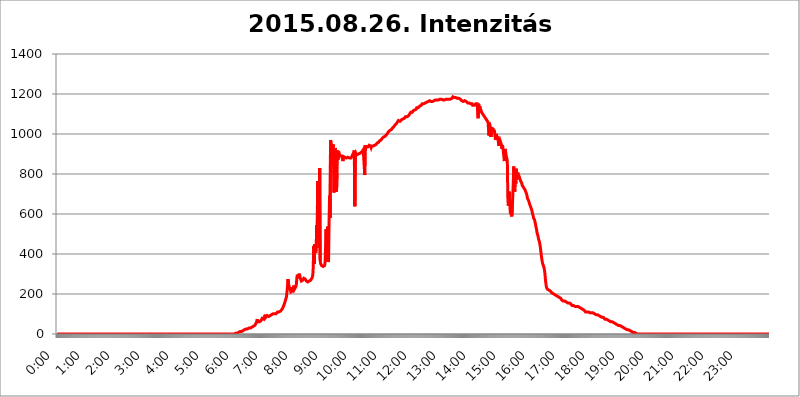
| Category | 2015.08.26. Intenzitás [W/m^2] |
|---|---|
| 0.0 | 0 |
| 0.0006944444444444445 | 0 |
| 0.001388888888888889 | 0 |
| 0.0020833333333333333 | 0 |
| 0.002777777777777778 | 0 |
| 0.003472222222222222 | 0 |
| 0.004166666666666667 | 0 |
| 0.004861111111111111 | 0 |
| 0.005555555555555556 | 0 |
| 0.0062499999999999995 | 0 |
| 0.006944444444444444 | 0 |
| 0.007638888888888889 | 0 |
| 0.008333333333333333 | 0 |
| 0.009027777777777779 | 0 |
| 0.009722222222222222 | 0 |
| 0.010416666666666666 | 0 |
| 0.011111111111111112 | 0 |
| 0.011805555555555555 | 0 |
| 0.012499999999999999 | 0 |
| 0.013194444444444444 | 0 |
| 0.013888888888888888 | 0 |
| 0.014583333333333332 | 0 |
| 0.015277777777777777 | 0 |
| 0.015972222222222224 | 0 |
| 0.016666666666666666 | 0 |
| 0.017361111111111112 | 0 |
| 0.018055555555555557 | 0 |
| 0.01875 | 0 |
| 0.019444444444444445 | 0 |
| 0.02013888888888889 | 0 |
| 0.020833333333333332 | 0 |
| 0.02152777777777778 | 0 |
| 0.022222222222222223 | 0 |
| 0.02291666666666667 | 0 |
| 0.02361111111111111 | 0 |
| 0.024305555555555556 | 0 |
| 0.024999999999999998 | 0 |
| 0.025694444444444447 | 0 |
| 0.02638888888888889 | 0 |
| 0.027083333333333334 | 0 |
| 0.027777777777777776 | 0 |
| 0.02847222222222222 | 0 |
| 0.029166666666666664 | 0 |
| 0.029861111111111113 | 0 |
| 0.030555555555555555 | 0 |
| 0.03125 | 0 |
| 0.03194444444444445 | 0 |
| 0.03263888888888889 | 0 |
| 0.03333333333333333 | 0 |
| 0.034027777777777775 | 0 |
| 0.034722222222222224 | 0 |
| 0.035416666666666666 | 0 |
| 0.036111111111111115 | 0 |
| 0.03680555555555556 | 0 |
| 0.0375 | 0 |
| 0.03819444444444444 | 0 |
| 0.03888888888888889 | 0 |
| 0.03958333333333333 | 0 |
| 0.04027777777777778 | 0 |
| 0.04097222222222222 | 0 |
| 0.041666666666666664 | 0 |
| 0.042361111111111106 | 0 |
| 0.04305555555555556 | 0 |
| 0.043750000000000004 | 0 |
| 0.044444444444444446 | 0 |
| 0.04513888888888889 | 0 |
| 0.04583333333333334 | 0 |
| 0.04652777777777778 | 0 |
| 0.04722222222222222 | 0 |
| 0.04791666666666666 | 0 |
| 0.04861111111111111 | 0 |
| 0.049305555555555554 | 0 |
| 0.049999999999999996 | 0 |
| 0.05069444444444445 | 0 |
| 0.051388888888888894 | 0 |
| 0.052083333333333336 | 0 |
| 0.05277777777777778 | 0 |
| 0.05347222222222222 | 0 |
| 0.05416666666666667 | 0 |
| 0.05486111111111111 | 0 |
| 0.05555555555555555 | 0 |
| 0.05625 | 0 |
| 0.05694444444444444 | 0 |
| 0.057638888888888885 | 0 |
| 0.05833333333333333 | 0 |
| 0.05902777777777778 | 0 |
| 0.059722222222222225 | 0 |
| 0.06041666666666667 | 0 |
| 0.061111111111111116 | 0 |
| 0.06180555555555556 | 0 |
| 0.0625 | 0 |
| 0.06319444444444444 | 0 |
| 0.06388888888888888 | 0 |
| 0.06458333333333334 | 0 |
| 0.06527777777777778 | 0 |
| 0.06597222222222222 | 0 |
| 0.06666666666666667 | 0 |
| 0.06736111111111111 | 0 |
| 0.06805555555555555 | 0 |
| 0.06874999999999999 | 0 |
| 0.06944444444444443 | 0 |
| 0.07013888888888889 | 0 |
| 0.07083333333333333 | 0 |
| 0.07152777777777779 | 0 |
| 0.07222222222222223 | 0 |
| 0.07291666666666667 | 0 |
| 0.07361111111111111 | 0 |
| 0.07430555555555556 | 0 |
| 0.075 | 0 |
| 0.07569444444444444 | 0 |
| 0.0763888888888889 | 0 |
| 0.07708333333333334 | 0 |
| 0.07777777777777778 | 0 |
| 0.07847222222222222 | 0 |
| 0.07916666666666666 | 0 |
| 0.0798611111111111 | 0 |
| 0.08055555555555556 | 0 |
| 0.08125 | 0 |
| 0.08194444444444444 | 0 |
| 0.08263888888888889 | 0 |
| 0.08333333333333333 | 0 |
| 0.08402777777777777 | 0 |
| 0.08472222222222221 | 0 |
| 0.08541666666666665 | 0 |
| 0.08611111111111112 | 0 |
| 0.08680555555555557 | 0 |
| 0.08750000000000001 | 0 |
| 0.08819444444444445 | 0 |
| 0.08888888888888889 | 0 |
| 0.08958333333333333 | 0 |
| 0.09027777777777778 | 0 |
| 0.09097222222222222 | 0 |
| 0.09166666666666667 | 0 |
| 0.09236111111111112 | 0 |
| 0.09305555555555556 | 0 |
| 0.09375 | 0 |
| 0.09444444444444444 | 0 |
| 0.09513888888888888 | 0 |
| 0.09583333333333333 | 0 |
| 0.09652777777777777 | 0 |
| 0.09722222222222222 | 0 |
| 0.09791666666666667 | 0 |
| 0.09861111111111111 | 0 |
| 0.09930555555555555 | 0 |
| 0.09999999999999999 | 0 |
| 0.10069444444444443 | 0 |
| 0.1013888888888889 | 0 |
| 0.10208333333333335 | 0 |
| 0.10277777777777779 | 0 |
| 0.10347222222222223 | 0 |
| 0.10416666666666667 | 0 |
| 0.10486111111111111 | 0 |
| 0.10555555555555556 | 0 |
| 0.10625 | 0 |
| 0.10694444444444444 | 0 |
| 0.1076388888888889 | 0 |
| 0.10833333333333334 | 0 |
| 0.10902777777777778 | 0 |
| 0.10972222222222222 | 0 |
| 0.1111111111111111 | 0 |
| 0.11180555555555556 | 0 |
| 0.11180555555555556 | 0 |
| 0.1125 | 0 |
| 0.11319444444444444 | 0 |
| 0.11388888888888889 | 0 |
| 0.11458333333333333 | 0 |
| 0.11527777777777777 | 0 |
| 0.11597222222222221 | 0 |
| 0.11666666666666665 | 0 |
| 0.1173611111111111 | 0 |
| 0.11805555555555557 | 0 |
| 0.11944444444444445 | 0 |
| 0.12013888888888889 | 0 |
| 0.12083333333333333 | 0 |
| 0.12152777777777778 | 0 |
| 0.12222222222222223 | 0 |
| 0.12291666666666667 | 0 |
| 0.12291666666666667 | 0 |
| 0.12361111111111112 | 0 |
| 0.12430555555555556 | 0 |
| 0.125 | 0 |
| 0.12569444444444444 | 0 |
| 0.12638888888888888 | 0 |
| 0.12708333333333333 | 0 |
| 0.16875 | 0 |
| 0.12847222222222224 | 0 |
| 0.12916666666666668 | 0 |
| 0.12986111111111112 | 0 |
| 0.13055555555555556 | 0 |
| 0.13125 | 0 |
| 0.13194444444444445 | 0 |
| 0.1326388888888889 | 0 |
| 0.13333333333333333 | 0 |
| 0.13402777777777777 | 0 |
| 0.13402777777777777 | 0 |
| 0.13472222222222222 | 0 |
| 0.13541666666666666 | 0 |
| 0.1361111111111111 | 0 |
| 0.13749999999999998 | 0 |
| 0.13819444444444443 | 0 |
| 0.1388888888888889 | 0 |
| 0.13958333333333334 | 0 |
| 0.14027777777777778 | 0 |
| 0.14097222222222222 | 0 |
| 0.14166666666666666 | 0 |
| 0.1423611111111111 | 0 |
| 0.14305555555555557 | 0 |
| 0.14375000000000002 | 0 |
| 0.14444444444444446 | 0 |
| 0.1451388888888889 | 0 |
| 0.1451388888888889 | 0 |
| 0.14652777777777778 | 0 |
| 0.14722222222222223 | 0 |
| 0.14791666666666667 | 0 |
| 0.1486111111111111 | 0 |
| 0.14930555555555555 | 0 |
| 0.15 | 0 |
| 0.15069444444444444 | 0 |
| 0.15138888888888888 | 0 |
| 0.15208333333333332 | 0 |
| 0.15277777777777776 | 0 |
| 0.15347222222222223 | 0 |
| 0.15416666666666667 | 0 |
| 0.15486111111111112 | 0 |
| 0.15555555555555556 | 0 |
| 0.15625 | 0 |
| 0.15694444444444444 | 0 |
| 0.15763888888888888 | 0 |
| 0.15833333333333333 | 0 |
| 0.15902777777777777 | 0 |
| 0.15972222222222224 | 0 |
| 0.16041666666666668 | 0 |
| 0.16111111111111112 | 0 |
| 0.16180555555555556 | 0 |
| 0.1625 | 0 |
| 0.16319444444444445 | 0 |
| 0.1638888888888889 | 0 |
| 0.16458333333333333 | 0 |
| 0.16527777777777777 | 0 |
| 0.16597222222222222 | 0 |
| 0.16666666666666666 | 0 |
| 0.1673611111111111 | 0 |
| 0.16805555555555554 | 0 |
| 0.16874999999999998 | 0 |
| 0.16944444444444443 | 0 |
| 0.17013888888888887 | 0 |
| 0.1708333333333333 | 0 |
| 0.17152777777777775 | 0 |
| 0.17222222222222225 | 0 |
| 0.1729166666666667 | 0 |
| 0.17361111111111113 | 0 |
| 0.17430555555555557 | 0 |
| 0.17500000000000002 | 0 |
| 0.17569444444444446 | 0 |
| 0.1763888888888889 | 0 |
| 0.17708333333333334 | 0 |
| 0.17777777777777778 | 0 |
| 0.17847222222222223 | 0 |
| 0.17916666666666667 | 0 |
| 0.1798611111111111 | 0 |
| 0.18055555555555555 | 0 |
| 0.18125 | 0 |
| 0.18194444444444444 | 0 |
| 0.1826388888888889 | 0 |
| 0.18333333333333335 | 0 |
| 0.1840277777777778 | 0 |
| 0.18472222222222223 | 0 |
| 0.18541666666666667 | 0 |
| 0.18611111111111112 | 0 |
| 0.18680555555555556 | 0 |
| 0.1875 | 0 |
| 0.18819444444444444 | 0 |
| 0.18888888888888888 | 0 |
| 0.18958333333333333 | 0 |
| 0.19027777777777777 | 0 |
| 0.1909722222222222 | 0 |
| 0.19166666666666665 | 0 |
| 0.19236111111111112 | 0 |
| 0.19305555555555554 | 0 |
| 0.19375 | 0 |
| 0.19444444444444445 | 0 |
| 0.1951388888888889 | 0 |
| 0.19583333333333333 | 0 |
| 0.19652777777777777 | 0 |
| 0.19722222222222222 | 0 |
| 0.19791666666666666 | 0 |
| 0.1986111111111111 | 0 |
| 0.19930555555555554 | 0 |
| 0.19999999999999998 | 0 |
| 0.20069444444444443 | 0 |
| 0.20138888888888887 | 0 |
| 0.2020833333333333 | 0 |
| 0.2027777777777778 | 0 |
| 0.2034722222222222 | 0 |
| 0.2041666666666667 | 0 |
| 0.20486111111111113 | 0 |
| 0.20555555555555557 | 0 |
| 0.20625000000000002 | 0 |
| 0.20694444444444446 | 0 |
| 0.2076388888888889 | 0 |
| 0.20833333333333334 | 0 |
| 0.20902777777777778 | 0 |
| 0.20972222222222223 | 0 |
| 0.21041666666666667 | 0 |
| 0.2111111111111111 | 0 |
| 0.21180555555555555 | 0 |
| 0.2125 | 0 |
| 0.21319444444444444 | 0 |
| 0.2138888888888889 | 0 |
| 0.21458333333333335 | 0 |
| 0.2152777777777778 | 0 |
| 0.21597222222222223 | 0 |
| 0.21666666666666667 | 0 |
| 0.21736111111111112 | 0 |
| 0.21805555555555556 | 0 |
| 0.21875 | 0 |
| 0.21944444444444444 | 0 |
| 0.22013888888888888 | 0 |
| 0.22083333333333333 | 0 |
| 0.22152777777777777 | 0 |
| 0.2222222222222222 | 0 |
| 0.22291666666666665 | 0 |
| 0.2236111111111111 | 0 |
| 0.22430555555555556 | 0 |
| 0.225 | 0 |
| 0.22569444444444445 | 0 |
| 0.2263888888888889 | 0 |
| 0.22708333333333333 | 0 |
| 0.22777777777777777 | 0 |
| 0.22847222222222222 | 0 |
| 0.22916666666666666 | 0 |
| 0.2298611111111111 | 0 |
| 0.23055555555555554 | 0 |
| 0.23124999999999998 | 0 |
| 0.23194444444444443 | 0 |
| 0.23263888888888887 | 0 |
| 0.2333333333333333 | 0 |
| 0.2340277777777778 | 0 |
| 0.2347222222222222 | 0 |
| 0.2354166666666667 | 0 |
| 0.23611111111111113 | 0 |
| 0.23680555555555557 | 0 |
| 0.23750000000000002 | 0 |
| 0.23819444444444446 | 0 |
| 0.2388888888888889 | 0 |
| 0.23958333333333334 | 0 |
| 0.24027777777777778 | 0 |
| 0.24097222222222223 | 0 |
| 0.24166666666666667 | 0 |
| 0.2423611111111111 | 0 |
| 0.24305555555555555 | 0 |
| 0.24375 | 0 |
| 0.24444444444444446 | 0 |
| 0.24513888888888888 | 0 |
| 0.24583333333333335 | 0 |
| 0.2465277777777778 | 0 |
| 0.24722222222222223 | 0 |
| 0.24791666666666667 | 0 |
| 0.24861111111111112 | 3.525 |
| 0.24930555555555556 | 3.525 |
| 0.25 | 3.525 |
| 0.25069444444444444 | 3.525 |
| 0.2513888888888889 | 3.525 |
| 0.2520833333333333 | 3.525 |
| 0.25277777777777777 | 3.525 |
| 0.2534722222222222 | 7.887 |
| 0.25416666666666665 | 7.887 |
| 0.2548611111111111 | 7.887 |
| 0.2555555555555556 | 7.887 |
| 0.25625000000000003 | 12.257 |
| 0.2569444444444445 | 12.257 |
| 0.2576388888888889 | 12.257 |
| 0.25833333333333336 | 12.257 |
| 0.2590277777777778 | 12.257 |
| 0.25972222222222224 | 12.257 |
| 0.2604166666666667 | 16.636 |
| 0.2611111111111111 | 16.636 |
| 0.26180555555555557 | 21.024 |
| 0.2625 | 21.024 |
| 0.26319444444444445 | 21.024 |
| 0.2638888888888889 | 21.024 |
| 0.26458333333333334 | 25.419 |
| 0.2652777777777778 | 25.419 |
| 0.2659722222222222 | 25.419 |
| 0.26666666666666666 | 25.419 |
| 0.2673611111111111 | 25.419 |
| 0.26805555555555555 | 25.419 |
| 0.26875 | 29.823 |
| 0.26944444444444443 | 29.823 |
| 0.2701388888888889 | 29.823 |
| 0.2708333333333333 | 29.823 |
| 0.27152777777777776 | 29.823 |
| 0.2722222222222222 | 34.234 |
| 0.27291666666666664 | 34.234 |
| 0.2736111111111111 | 34.234 |
| 0.2743055555555555 | 34.234 |
| 0.27499999999999997 | 38.653 |
| 0.27569444444444446 | 38.653 |
| 0.27638888888888885 | 38.653 |
| 0.27708333333333335 | 43.079 |
| 0.2777777777777778 | 47.511 |
| 0.27847222222222223 | 47.511 |
| 0.2791666666666667 | 56.398 |
| 0.2798611111111111 | 60.85 |
| 0.28055555555555556 | 74.246 |
| 0.28125 | 60.85 |
| 0.28194444444444444 | 56.398 |
| 0.2826388888888889 | 60.85 |
| 0.2833333333333333 | 60.85 |
| 0.28402777777777777 | 60.85 |
| 0.2847222222222222 | 65.31 |
| 0.28541666666666665 | 65.31 |
| 0.28611111111111115 | 65.31 |
| 0.28680555555555554 | 69.775 |
| 0.28750000000000003 | 78.722 |
| 0.2881944444444445 | 74.246 |
| 0.2888888888888889 | 74.246 |
| 0.28958333333333336 | 74.246 |
| 0.2902777777777778 | 74.246 |
| 0.29097222222222224 | 78.722 |
| 0.2916666666666667 | 96.682 |
| 0.2923611111111111 | 83.205 |
| 0.29305555555555557 | 83.205 |
| 0.29375 | 87.692 |
| 0.29444444444444445 | 92.184 |
| 0.2951388888888889 | 87.692 |
| 0.29583333333333334 | 87.692 |
| 0.2965277777777778 | 87.692 |
| 0.2972222222222222 | 87.692 |
| 0.29791666666666666 | 87.692 |
| 0.2986111111111111 | 92.184 |
| 0.29930555555555555 | 92.184 |
| 0.3 | 92.184 |
| 0.30069444444444443 | 96.682 |
| 0.3013888888888889 | 96.682 |
| 0.3020833333333333 | 96.682 |
| 0.30277777777777776 | 101.184 |
| 0.3034722222222222 | 101.184 |
| 0.30416666666666664 | 101.184 |
| 0.3048611111111111 | 101.184 |
| 0.3055555555555555 | 101.184 |
| 0.30624999999999997 | 101.184 |
| 0.3069444444444444 | 101.184 |
| 0.3076388888888889 | 105.69 |
| 0.30833333333333335 | 105.69 |
| 0.3090277777777778 | 110.201 |
| 0.30972222222222223 | 110.201 |
| 0.3104166666666667 | 110.201 |
| 0.3111111111111111 | 110.201 |
| 0.31180555555555556 | 110.201 |
| 0.3125 | 114.716 |
| 0.31319444444444444 | 114.716 |
| 0.3138888888888889 | 119.235 |
| 0.3145833333333333 | 119.235 |
| 0.31527777777777777 | 123.758 |
| 0.3159722222222222 | 128.284 |
| 0.31666666666666665 | 132.814 |
| 0.31736111111111115 | 137.347 |
| 0.31805555555555554 | 146.423 |
| 0.31875000000000003 | 150.964 |
| 0.3194444444444445 | 160.056 |
| 0.3201388888888889 | 164.605 |
| 0.32083333333333336 | 178.264 |
| 0.3215277777777778 | 187.378 |
| 0.32222222222222224 | 210.182 |
| 0.3229166666666667 | 237.564 |
| 0.3236111111111111 | 274.047 |
| 0.32430555555555557 | 251.251 |
| 0.325 | 242.127 |
| 0.32569444444444445 | 228.436 |
| 0.3263888888888889 | 219.309 |
| 0.32708333333333334 | 233 |
| 0.3277777777777778 | 210.182 |
| 0.3284722222222222 | 205.62 |
| 0.32916666666666666 | 214.746 |
| 0.3298611111111111 | 214.746 |
| 0.33055555555555555 | 219.309 |
| 0.33125 | 233 |
| 0.33194444444444443 | 242.127 |
| 0.3326388888888889 | 223.873 |
| 0.3333333333333333 | 228.436 |
| 0.3340277777777778 | 228.436 |
| 0.3347222222222222 | 237.564 |
| 0.3354166666666667 | 251.251 |
| 0.3361111111111111 | 283.156 |
| 0.3368055555555556 | 296.808 |
| 0.33749999999999997 | 292.259 |
| 0.33819444444444446 | 278.603 |
| 0.33888888888888885 | 283.156 |
| 0.33958333333333335 | 301.354 |
| 0.34027777777777773 | 287.709 |
| 0.34097222222222223 | 278.603 |
| 0.3416666666666666 | 278.603 |
| 0.3423611111111111 | 264.932 |
| 0.3430555555555555 | 269.49 |
| 0.34375 | 269.49 |
| 0.3444444444444445 | 269.49 |
| 0.3451388888888889 | 274.047 |
| 0.3458333333333334 | 278.603 |
| 0.34652777777777777 | 278.603 |
| 0.34722222222222227 | 278.603 |
| 0.34791666666666665 | 274.047 |
| 0.34861111111111115 | 269.49 |
| 0.34930555555555554 | 264.932 |
| 0.35000000000000003 | 260.373 |
| 0.3506944444444444 | 260.373 |
| 0.3513888888888889 | 260.373 |
| 0.3520833333333333 | 260.373 |
| 0.3527777777777778 | 260.373 |
| 0.3534722222222222 | 264.932 |
| 0.3541666666666667 | 264.932 |
| 0.3548611111111111 | 269.49 |
| 0.35555555555555557 | 269.49 |
| 0.35625 | 269.49 |
| 0.35694444444444445 | 274.047 |
| 0.3576388888888889 | 283.156 |
| 0.35833333333333334 | 292.259 |
| 0.3590277777777778 | 333.113 |
| 0.3597222222222222 | 440.702 |
| 0.36041666666666666 | 351.198 |
| 0.3611111111111111 | 449.551 |
| 0.36180555555555555 | 436.27 |
| 0.3625 | 405.108 |
| 0.36319444444444443 | 436.27 |
| 0.3638888888888889 | 545.416 |
| 0.3645833333333333 | 484.735 |
| 0.3652777777777778 | 763.674 |
| 0.3659722222222222 | 480.356 |
| 0.3666666666666667 | 703.762 |
| 0.3673611111111111 | 431.833 |
| 0.3680555555555556 | 829.981 |
| 0.36874999999999997 | 369.23 |
| 0.36944444444444446 | 351.198 |
| 0.37013888888888885 | 346.682 |
| 0.37083333333333335 | 342.162 |
| 0.37152777777777773 | 342.162 |
| 0.37222222222222223 | 337.639 |
| 0.3729166666666666 | 337.639 |
| 0.3736111111111111 | 337.639 |
| 0.3743055555555555 | 342.162 |
| 0.375 | 342.162 |
| 0.3756944444444445 | 360.221 |
| 0.3763888888888889 | 364.728 |
| 0.3770833333333334 | 523.88 |
| 0.37777777777777777 | 369.23 |
| 0.37847222222222227 | 449.551 |
| 0.37916666666666665 | 536.82 |
| 0.37986111111111115 | 360.221 |
| 0.38055555555555554 | 369.23 |
| 0.38125000000000003 | 566.793 |
| 0.3819444444444444 | 691.608 |
| 0.3826388888888889 | 579.542 |
| 0.3833333333333333 | 970.034 |
| 0.3840277777777778 | 947.58 |
| 0.3847222222222222 | 856.855 |
| 0.3854166666666667 | 925.06 |
| 0.3861111111111111 | 879.719 |
| 0.38680555555555557 | 947.58 |
| 0.3875 | 845.365 |
| 0.38819444444444445 | 707.8 |
| 0.3888888888888889 | 909.996 |
| 0.38958333333333334 | 928.819 |
| 0.3902777777777778 | 921.298 |
| 0.3909722222222222 | 853.029 |
| 0.39166666666666666 | 711.832 |
| 0.3923611111111111 | 798.974 |
| 0.39305555555555555 | 917.534 |
| 0.39375 | 872.114 |
| 0.39444444444444443 | 913.766 |
| 0.3951388888888889 | 906.223 |
| 0.3958333333333333 | 898.668 |
| 0.3965277777777778 | 894.885 |
| 0.3972222222222222 | 891.099 |
| 0.3979166666666667 | 891.099 |
| 0.3986111111111111 | 891.099 |
| 0.3993055555555556 | 887.309 |
| 0.39999999999999997 | 887.309 |
| 0.40069444444444446 | 864.493 |
| 0.40138888888888885 | 887.309 |
| 0.40208333333333335 | 887.309 |
| 0.40277777777777773 | 887.309 |
| 0.40347222222222223 | 883.516 |
| 0.4041666666666666 | 883.516 |
| 0.4048611111111111 | 883.516 |
| 0.4055555555555555 | 879.719 |
| 0.40625 | 879.719 |
| 0.4069444444444445 | 879.719 |
| 0.4076388888888889 | 883.516 |
| 0.4083333333333334 | 883.516 |
| 0.40902777777777777 | 879.719 |
| 0.40972222222222227 | 879.719 |
| 0.41041666666666665 | 879.719 |
| 0.41111111111111115 | 879.719 |
| 0.41180555555555554 | 879.719 |
| 0.41250000000000003 | 883.516 |
| 0.4131944444444444 | 887.309 |
| 0.4138888888888889 | 894.885 |
| 0.4145833333333333 | 898.668 |
| 0.4152777777777778 | 902.447 |
| 0.4159722222222222 | 906.223 |
| 0.4166666666666667 | 917.534 |
| 0.4173611111111111 | 638.256 |
| 0.41805555555555557 | 894.885 |
| 0.41875 | 902.447 |
| 0.41944444444444445 | 894.885 |
| 0.4201388888888889 | 894.885 |
| 0.42083333333333334 | 898.668 |
| 0.4215277777777778 | 898.668 |
| 0.4222222222222222 | 902.447 |
| 0.42291666666666666 | 902.447 |
| 0.4236111111111111 | 902.447 |
| 0.42430555555555555 | 902.447 |
| 0.425 | 906.223 |
| 0.42569444444444443 | 906.223 |
| 0.4263888888888889 | 909.996 |
| 0.4270833333333333 | 909.996 |
| 0.4277777777777778 | 913.766 |
| 0.4284722222222222 | 917.534 |
| 0.4291666666666667 | 921.298 |
| 0.4298611111111111 | 925.06 |
| 0.4305555555555556 | 925.06 |
| 0.43124999999999997 | 795.074 |
| 0.43194444444444446 | 943.832 |
| 0.43263888888888885 | 928.819 |
| 0.43333333333333335 | 928.819 |
| 0.43402777777777773 | 936.33 |
| 0.43472222222222223 | 932.576 |
| 0.4354166666666666 | 932.576 |
| 0.4361111111111111 | 936.33 |
| 0.4368055555555555 | 940.082 |
| 0.4375 | 943.832 |
| 0.4381944444444445 | 943.832 |
| 0.4388888888888889 | 940.082 |
| 0.4395833333333334 | 940.082 |
| 0.44027777777777777 | 932.576 |
| 0.44097222222222227 | 940.082 |
| 0.44166666666666665 | 940.082 |
| 0.44236111111111115 | 940.082 |
| 0.44305555555555554 | 940.082 |
| 0.44375000000000003 | 940.082 |
| 0.4444444444444444 | 943.832 |
| 0.4451388888888889 | 943.832 |
| 0.4458333333333333 | 947.58 |
| 0.4465277777777778 | 947.58 |
| 0.4472222222222222 | 947.58 |
| 0.4479166666666667 | 951.327 |
| 0.4486111111111111 | 955.071 |
| 0.44930555555555557 | 955.071 |
| 0.45 | 958.814 |
| 0.45069444444444445 | 958.814 |
| 0.4513888888888889 | 962.555 |
| 0.45208333333333334 | 966.295 |
| 0.4527777777777778 | 970.034 |
| 0.4534722222222222 | 970.034 |
| 0.45416666666666666 | 970.034 |
| 0.4548611111111111 | 973.772 |
| 0.45555555555555555 | 977.508 |
| 0.45625 | 977.508 |
| 0.45694444444444443 | 981.244 |
| 0.4576388888888889 | 984.98 |
| 0.4583333333333333 | 984.98 |
| 0.4590277777777778 | 988.714 |
| 0.4597222222222222 | 988.714 |
| 0.4604166666666667 | 992.448 |
| 0.4611111111111111 | 992.448 |
| 0.4618055555555556 | 996.182 |
| 0.46249999999999997 | 999.916 |
| 0.46319444444444446 | 1003.65 |
| 0.46388888888888885 | 1007.383 |
| 0.46458333333333335 | 1011.118 |
| 0.46527777777777773 | 1014.852 |
| 0.46597222222222223 | 1014.852 |
| 0.4666666666666666 | 1018.587 |
| 0.4673611111111111 | 1018.587 |
| 0.4680555555555555 | 1018.587 |
| 0.46875 | 1022.323 |
| 0.4694444444444445 | 1026.06 |
| 0.4701388888888889 | 1029.798 |
| 0.4708333333333334 | 1029.798 |
| 0.47152777777777777 | 1033.537 |
| 0.47222222222222227 | 1037.277 |
| 0.47291666666666665 | 1041.019 |
| 0.47361111111111115 | 1044.762 |
| 0.47430555555555554 | 1044.762 |
| 0.47500000000000003 | 1048.508 |
| 0.4756944444444444 | 1052.255 |
| 0.4763888888888889 | 1056.004 |
| 0.4770833333333333 | 1059.756 |
| 0.4777777777777778 | 1063.51 |
| 0.4784722222222222 | 1067.267 |
| 0.4791666666666667 | 1063.51 |
| 0.4798611111111111 | 1067.267 |
| 0.48055555555555557 | 1063.51 |
| 0.48125 | 1063.51 |
| 0.48194444444444445 | 1067.267 |
| 0.4826388888888889 | 1071.027 |
| 0.48333333333333334 | 1074.789 |
| 0.4840277777777778 | 1071.027 |
| 0.4847222222222222 | 1074.789 |
| 0.48541666666666666 | 1074.789 |
| 0.4861111111111111 | 1074.789 |
| 0.48680555555555555 | 1078.555 |
| 0.4875 | 1082.324 |
| 0.48819444444444443 | 1086.097 |
| 0.4888888888888889 | 1086.097 |
| 0.4895833333333333 | 1086.097 |
| 0.4902777777777778 | 1086.097 |
| 0.4909722222222222 | 1086.097 |
| 0.4916666666666667 | 1086.097 |
| 0.4923611111111111 | 1089.873 |
| 0.4930555555555556 | 1093.653 |
| 0.49374999999999997 | 1093.653 |
| 0.49444444444444446 | 1101.226 |
| 0.49513888888888885 | 1105.019 |
| 0.49583333333333335 | 1108.816 |
| 0.49652777777777773 | 1108.816 |
| 0.49722222222222223 | 1108.816 |
| 0.4979166666666666 | 1108.816 |
| 0.4986111111111111 | 1112.618 |
| 0.4993055555555555 | 1116.426 |
| 0.5 | 1116.426 |
| 0.5006944444444444 | 1116.426 |
| 0.5013888888888889 | 1120.238 |
| 0.5020833333333333 | 1120.238 |
| 0.5027777777777778 | 1124.056 |
| 0.5034722222222222 | 1124.056 |
| 0.5041666666666667 | 1131.708 |
| 0.5048611111111111 | 1131.708 |
| 0.5055555555555555 | 1131.708 |
| 0.50625 | 1131.708 |
| 0.5069444444444444 | 1131.708 |
| 0.5076388888888889 | 1131.708 |
| 0.5083333333333333 | 1139.384 |
| 0.5090277777777777 | 1139.384 |
| 0.5097222222222222 | 1139.384 |
| 0.5104166666666666 | 1143.232 |
| 0.5111111111111112 | 1147.086 |
| 0.5118055555555555 | 1150.946 |
| 0.5125000000000001 | 1150.946 |
| 0.5131944444444444 | 1150.946 |
| 0.513888888888889 | 1150.946 |
| 0.5145833333333333 | 1154.814 |
| 0.5152777777777778 | 1154.814 |
| 0.5159722222222222 | 1154.814 |
| 0.5166666666666667 | 1158.689 |
| 0.517361111111111 | 1158.689 |
| 0.5180555555555556 | 1158.689 |
| 0.5187499999999999 | 1162.571 |
| 0.5194444444444445 | 1158.689 |
| 0.5201388888888888 | 1162.571 |
| 0.5208333333333334 | 1162.571 |
| 0.5215277777777778 | 1162.571 |
| 0.5222222222222223 | 1166.46 |
| 0.5229166666666667 | 1166.46 |
| 0.5236111111111111 | 1166.46 |
| 0.5243055555555556 | 1162.571 |
| 0.525 | 1166.46 |
| 0.5256944444444445 | 1162.571 |
| 0.5263888888888889 | 1162.571 |
| 0.5270833333333333 | 1162.571 |
| 0.5277777777777778 | 1166.46 |
| 0.5284722222222222 | 1166.46 |
| 0.5291666666666667 | 1170.358 |
| 0.5298611111111111 | 1170.358 |
| 0.5305555555555556 | 1170.358 |
| 0.53125 | 1170.358 |
| 0.5319444444444444 | 1170.358 |
| 0.5326388888888889 | 1170.358 |
| 0.5333333333333333 | 1174.263 |
| 0.5340277777777778 | 1170.358 |
| 0.5347222222222222 | 1170.358 |
| 0.5354166666666667 | 1174.263 |
| 0.5361111111111111 | 1174.263 |
| 0.5368055555555555 | 1174.263 |
| 0.5375 | 1174.263 |
| 0.5381944444444444 | 1178.177 |
| 0.5388888888888889 | 1174.263 |
| 0.5395833333333333 | 1170.358 |
| 0.5402777777777777 | 1170.358 |
| 0.5409722222222222 | 1170.358 |
| 0.5416666666666666 | 1170.358 |
| 0.5423611111111112 | 1170.358 |
| 0.5430555555555555 | 1170.358 |
| 0.5437500000000001 | 1174.263 |
| 0.5444444444444444 | 1174.263 |
| 0.545138888888889 | 1174.263 |
| 0.5458333333333333 | 1174.263 |
| 0.5465277777777778 | 1174.263 |
| 0.5472222222222222 | 1174.263 |
| 0.5479166666666667 | 1174.263 |
| 0.548611111111111 | 1174.263 |
| 0.5493055555555556 | 1174.263 |
| 0.5499999999999999 | 1174.263 |
| 0.5506944444444445 | 1174.263 |
| 0.5513888888888888 | 1174.263 |
| 0.5520833333333334 | 1174.263 |
| 0.5527777777777778 | 1178.177 |
| 0.5534722222222223 | 1178.177 |
| 0.5541666666666667 | 1182.099 |
| 0.5548611111111111 | 1186.03 |
| 0.5555555555555556 | 1186.03 |
| 0.55625 | 1186.03 |
| 0.5569444444444445 | 1182.099 |
| 0.5576388888888889 | 1182.099 |
| 0.5583333333333333 | 1182.099 |
| 0.5590277777777778 | 1182.099 |
| 0.5597222222222222 | 1178.177 |
| 0.5604166666666667 | 1178.177 |
| 0.5611111111111111 | 1178.177 |
| 0.5618055555555556 | 1178.177 |
| 0.5625 | 1178.177 |
| 0.5631944444444444 | 1178.177 |
| 0.5638888888888889 | 1178.177 |
| 0.5645833333333333 | 1174.263 |
| 0.5652777777777778 | 1174.263 |
| 0.5659722222222222 | 1170.358 |
| 0.5666666666666667 | 1170.358 |
| 0.5673611111111111 | 1166.46 |
| 0.5680555555555555 | 1166.46 |
| 0.56875 | 1166.46 |
| 0.5694444444444444 | 1162.571 |
| 0.5701388888888889 | 1166.46 |
| 0.5708333333333333 | 1166.46 |
| 0.5715277777777777 | 1166.46 |
| 0.5722222222222222 | 1166.46 |
| 0.5729166666666666 | 1162.571 |
| 0.5736111111111112 | 1162.571 |
| 0.5743055555555555 | 1162.571 |
| 0.5750000000000001 | 1158.689 |
| 0.5756944444444444 | 1154.814 |
| 0.576388888888889 | 1154.814 |
| 0.5770833333333333 | 1158.689 |
| 0.5777777777777778 | 1154.814 |
| 0.5784722222222222 | 1150.946 |
| 0.5791666666666667 | 1150.946 |
| 0.579861111111111 | 1150.946 |
| 0.5805555555555556 | 1150.946 |
| 0.5812499999999999 | 1147.086 |
| 0.5819444444444445 | 1150.946 |
| 0.5826388888888888 | 1143.232 |
| 0.5833333333333334 | 1143.232 |
| 0.5840277777777778 | 1143.232 |
| 0.5847222222222223 | 1143.232 |
| 0.5854166666666667 | 1147.086 |
| 0.5861111111111111 | 1147.086 |
| 0.5868055555555556 | 1150.946 |
| 0.5875 | 1150.946 |
| 0.5881944444444445 | 1150.946 |
| 0.5888888888888889 | 1150.946 |
| 0.5895833333333333 | 1154.814 |
| 0.5902777777777778 | 1078.555 |
| 0.5909722222222222 | 1150.946 |
| 0.5916666666666667 | 1124.056 |
| 0.5923611111111111 | 1139.384 |
| 0.5930555555555556 | 1120.238 |
| 0.59375 | 1105.019 |
| 0.5944444444444444 | 1116.426 |
| 0.5951388888888889 | 1108.816 |
| 0.5958333333333333 | 1105.019 |
| 0.5965277777777778 | 1101.226 |
| 0.5972222222222222 | 1097.437 |
| 0.5979166666666667 | 1093.653 |
| 0.5986111111111111 | 1089.873 |
| 0.5993055555555555 | 1089.873 |
| 0.6 | 1082.324 |
| 0.6006944444444444 | 1078.555 |
| 0.6013888888888889 | 1074.789 |
| 0.6020833333333333 | 1074.789 |
| 0.6027777777777777 | 1067.267 |
| 0.6034722222222222 | 1063.51 |
| 0.6041666666666666 | 1059.756 |
| 0.6048611111111112 | 1059.756 |
| 0.6055555555555555 | 992.448 |
| 0.6062500000000001 | 1056.004 |
| 0.6069444444444444 | 1052.255 |
| 0.607638888888889 | 1052.255 |
| 0.6083333333333333 | 984.98 |
| 0.6090277777777778 | 1029.798 |
| 0.6097222222222222 | 1033.537 |
| 0.6104166666666667 | 1026.06 |
| 0.611111111111111 | 1026.06 |
| 0.6118055555555556 | 1022.323 |
| 0.6124999999999999 | 1022.323 |
| 0.6131944444444445 | 1014.852 |
| 0.6138888888888888 | 1011.118 |
| 0.6145833333333334 | 970.034 |
| 0.6152777777777778 | 999.916 |
| 0.6159722222222223 | 992.448 |
| 0.6166666666666667 | 988.714 |
| 0.6173611111111111 | 984.98 |
| 0.6180555555555556 | 984.98 |
| 0.61875 | 958.814 |
| 0.6194444444444445 | 940.082 |
| 0.6201388888888889 | 962.555 |
| 0.6208333333333333 | 970.034 |
| 0.6215277777777778 | 962.555 |
| 0.6222222222222222 | 958.814 |
| 0.6229166666666667 | 947.58 |
| 0.6236111111111111 | 925.06 |
| 0.6243055555555556 | 943.832 |
| 0.625 | 932.576 |
| 0.6256944444444444 | 936.33 |
| 0.6263888888888889 | 928.819 |
| 0.6270833333333333 | 864.493 |
| 0.6277777777777778 | 925.06 |
| 0.6284722222222222 | 917.534 |
| 0.6291666666666667 | 902.447 |
| 0.6298611111111111 | 887.309 |
| 0.6305555555555555 | 891.099 |
| 0.63125 | 868.305 |
| 0.6319444444444444 | 683.473 |
| 0.6326388888888889 | 642.4 |
| 0.6333333333333333 | 679.395 |
| 0.6340277777777777 | 711.832 |
| 0.6347222222222222 | 646.537 |
| 0.6354166666666666 | 609.062 |
| 0.6361111111111112 | 609.062 |
| 0.6368055555555555 | 613.252 |
| 0.6375000000000001 | 588.009 |
| 0.6381944444444444 | 621.613 |
| 0.638888888888889 | 621.613 |
| 0.6395833333333333 | 759.723 |
| 0.6402777777777778 | 837.682 |
| 0.6409722222222222 | 755.766 |
| 0.6416666666666667 | 711.832 |
| 0.642361111111111 | 806.757 |
| 0.6430555555555556 | 751.803 |
| 0.6437499999999999 | 826.123 |
| 0.6444444444444445 | 771.559 |
| 0.6451388888888888 | 787.258 |
| 0.6458333333333334 | 806.757 |
| 0.6465277777777778 | 798.974 |
| 0.6472222222222223 | 795.074 |
| 0.6479166666666667 | 787.258 |
| 0.6486111111111111 | 779.42 |
| 0.6493055555555556 | 775.492 |
| 0.65 | 763.674 |
| 0.6506944444444445 | 759.723 |
| 0.6513888888888889 | 755.766 |
| 0.6520833333333333 | 743.859 |
| 0.6527777777777778 | 739.877 |
| 0.6534722222222222 | 735.89 |
| 0.6541666666666667 | 731.896 |
| 0.6548611111111111 | 727.896 |
| 0.6555555555555556 | 723.889 |
| 0.65625 | 719.877 |
| 0.6569444444444444 | 711.832 |
| 0.6576388888888889 | 707.8 |
| 0.6583333333333333 | 699.717 |
| 0.6590277777777778 | 687.544 |
| 0.6597222222222222 | 675.311 |
| 0.6604166666666667 | 671.22 |
| 0.6611111111111111 | 667.123 |
| 0.6618055555555555 | 658.909 |
| 0.6625 | 650.667 |
| 0.6631944444444444 | 642.4 |
| 0.6638888888888889 | 638.256 |
| 0.6645833333333333 | 629.948 |
| 0.6652777777777777 | 621.613 |
| 0.6659722222222222 | 613.252 |
| 0.6666666666666666 | 600.661 |
| 0.6673611111111111 | 592.233 |
| 0.6680555555555556 | 579.542 |
| 0.6687500000000001 | 575.299 |
| 0.6694444444444444 | 571.049 |
| 0.6701388888888888 | 558.261 |
| 0.6708333333333334 | 549.704 |
| 0.6715277777777778 | 532.513 |
| 0.6722222222222222 | 523.88 |
| 0.6729166666666666 | 506.542 |
| 0.6736111111111112 | 497.836 |
| 0.6743055555555556 | 489.108 |
| 0.6749999999999999 | 475.972 |
| 0.6756944444444444 | 467.187 |
| 0.6763888888888889 | 458.38 |
| 0.6770833333333334 | 445.129 |
| 0.6777777777777777 | 427.39 |
| 0.6784722222222223 | 405.108 |
| 0.6791666666666667 | 387.202 |
| 0.6798611111111111 | 369.23 |
| 0.6805555555555555 | 355.712 |
| 0.68125 | 346.682 |
| 0.6819444444444445 | 342.162 |
| 0.6826388888888889 | 333.113 |
| 0.6833333333333332 | 319.517 |
| 0.6840277777777778 | 301.354 |
| 0.6847222222222222 | 269.49 |
| 0.6854166666666667 | 251.251 |
| 0.686111111111111 | 233 |
| 0.6868055555555556 | 228.436 |
| 0.6875 | 223.873 |
| 0.6881944444444444 | 223.873 |
| 0.688888888888889 | 219.309 |
| 0.6895833333333333 | 219.309 |
| 0.6902777777777778 | 219.309 |
| 0.6909722222222222 | 214.746 |
| 0.6916666666666668 | 214.746 |
| 0.6923611111111111 | 210.182 |
| 0.6930555555555555 | 210.182 |
| 0.69375 | 205.62 |
| 0.6944444444444445 | 205.62 |
| 0.6951388888888889 | 201.058 |
| 0.6958333333333333 | 201.058 |
| 0.6965277777777777 | 201.058 |
| 0.6972222222222223 | 196.497 |
| 0.6979166666666666 | 196.497 |
| 0.6986111111111111 | 196.497 |
| 0.6993055555555556 | 191.937 |
| 0.7000000000000001 | 191.937 |
| 0.7006944444444444 | 191.937 |
| 0.7013888888888888 | 187.378 |
| 0.7020833333333334 | 187.378 |
| 0.7027777777777778 | 187.378 |
| 0.7034722222222222 | 182.82 |
| 0.7041666666666666 | 182.82 |
| 0.7048611111111112 | 182.82 |
| 0.7055555555555556 | 178.264 |
| 0.7062499999999999 | 178.264 |
| 0.7069444444444444 | 173.709 |
| 0.7076388888888889 | 169.156 |
| 0.7083333333333334 | 169.156 |
| 0.7090277777777777 | 164.605 |
| 0.7097222222222223 | 164.605 |
| 0.7104166666666667 | 164.605 |
| 0.7111111111111111 | 164.605 |
| 0.7118055555555555 | 164.605 |
| 0.7125 | 160.056 |
| 0.7131944444444445 | 160.056 |
| 0.7138888888888889 | 160.056 |
| 0.7145833333333332 | 155.509 |
| 0.7152777777777778 | 155.509 |
| 0.7159722222222222 | 155.509 |
| 0.7166666666666667 | 155.509 |
| 0.717361111111111 | 155.509 |
| 0.7180555555555556 | 155.509 |
| 0.71875 | 150.964 |
| 0.7194444444444444 | 150.964 |
| 0.720138888888889 | 150.964 |
| 0.7208333333333333 | 146.423 |
| 0.7215277777777778 | 146.423 |
| 0.7222222222222222 | 141.884 |
| 0.7229166666666668 | 146.423 |
| 0.7236111111111111 | 146.423 |
| 0.7243055555555555 | 141.884 |
| 0.725 | 137.347 |
| 0.7256944444444445 | 137.347 |
| 0.7263888888888889 | 137.347 |
| 0.7270833333333333 | 137.347 |
| 0.7277777777777777 | 137.347 |
| 0.7284722222222223 | 137.347 |
| 0.7291666666666666 | 137.347 |
| 0.7298611111111111 | 137.347 |
| 0.7305555555555556 | 137.347 |
| 0.7312500000000001 | 132.814 |
| 0.7319444444444444 | 132.814 |
| 0.7326388888888888 | 132.814 |
| 0.7333333333333334 | 132.814 |
| 0.7340277777777778 | 128.284 |
| 0.7347222222222222 | 128.284 |
| 0.7354166666666666 | 123.758 |
| 0.7361111111111112 | 123.758 |
| 0.7368055555555556 | 123.758 |
| 0.7374999999999999 | 123.758 |
| 0.7381944444444444 | 119.235 |
| 0.7388888888888889 | 119.235 |
| 0.7395833333333334 | 119.235 |
| 0.7402777777777777 | 114.716 |
| 0.7409722222222223 | 110.201 |
| 0.7416666666666667 | 110.201 |
| 0.7423611111111111 | 105.69 |
| 0.7430555555555555 | 110.201 |
| 0.74375 | 105.69 |
| 0.7444444444444445 | 105.69 |
| 0.7451388888888889 | 110.201 |
| 0.7458333333333332 | 105.69 |
| 0.7465277777777778 | 105.69 |
| 0.7472222222222222 | 105.69 |
| 0.7479166666666667 | 105.69 |
| 0.748611111111111 | 105.69 |
| 0.7493055555555556 | 105.69 |
| 0.75 | 105.69 |
| 0.7506944444444444 | 105.69 |
| 0.751388888888889 | 105.69 |
| 0.7520833333333333 | 101.184 |
| 0.7527777777777778 | 101.184 |
| 0.7534722222222222 | 101.184 |
| 0.7541666666666668 | 101.184 |
| 0.7548611111111111 | 96.682 |
| 0.7555555555555555 | 96.682 |
| 0.75625 | 96.682 |
| 0.7569444444444445 | 96.682 |
| 0.7576388888888889 | 96.682 |
| 0.7583333333333333 | 92.184 |
| 0.7590277777777777 | 92.184 |
| 0.7597222222222223 | 92.184 |
| 0.7604166666666666 | 87.692 |
| 0.7611111111111111 | 87.692 |
| 0.7618055555555556 | 87.692 |
| 0.7625000000000001 | 83.205 |
| 0.7631944444444444 | 83.205 |
| 0.7638888888888888 | 83.205 |
| 0.7645833333333334 | 83.205 |
| 0.7652777777777778 | 83.205 |
| 0.7659722222222222 | 83.205 |
| 0.7666666666666666 | 78.722 |
| 0.7673611111111112 | 78.722 |
| 0.7680555555555556 | 74.246 |
| 0.7687499999999999 | 74.246 |
| 0.7694444444444444 | 74.246 |
| 0.7701388888888889 | 74.246 |
| 0.7708333333333334 | 74.246 |
| 0.7715277777777777 | 69.775 |
| 0.7722222222222223 | 69.775 |
| 0.7729166666666667 | 69.775 |
| 0.7736111111111111 | 65.31 |
| 0.7743055555555555 | 65.31 |
| 0.775 | 65.31 |
| 0.7756944444444445 | 65.31 |
| 0.7763888888888889 | 60.85 |
| 0.7770833333333332 | 60.85 |
| 0.7777777777777778 | 60.85 |
| 0.7784722222222222 | 60.85 |
| 0.7791666666666667 | 56.398 |
| 0.779861111111111 | 56.398 |
| 0.7805555555555556 | 56.398 |
| 0.78125 | 56.398 |
| 0.7819444444444444 | 51.951 |
| 0.782638888888889 | 51.951 |
| 0.7833333333333333 | 51.951 |
| 0.7840277777777778 | 47.511 |
| 0.7847222222222222 | 47.511 |
| 0.7854166666666668 | 47.511 |
| 0.7861111111111111 | 47.511 |
| 0.7868055555555555 | 43.079 |
| 0.7875 | 43.079 |
| 0.7881944444444445 | 43.079 |
| 0.7888888888888889 | 43.079 |
| 0.7895833333333333 | 38.653 |
| 0.7902777777777777 | 38.653 |
| 0.7909722222222223 | 38.653 |
| 0.7916666666666666 | 34.234 |
| 0.7923611111111111 | 34.234 |
| 0.7930555555555556 | 34.234 |
| 0.7937500000000001 | 29.823 |
| 0.7944444444444444 | 29.823 |
| 0.7951388888888888 | 29.823 |
| 0.7958333333333334 | 29.823 |
| 0.7965277777777778 | 29.823 |
| 0.7972222222222222 | 25.419 |
| 0.7979166666666666 | 25.419 |
| 0.7986111111111112 | 25.419 |
| 0.7993055555555556 | 21.024 |
| 0.7999999999999999 | 21.024 |
| 0.8006944444444444 | 21.024 |
| 0.8013888888888889 | 21.024 |
| 0.8020833333333334 | 21.024 |
| 0.8027777777777777 | 16.636 |
| 0.8034722222222223 | 16.636 |
| 0.8041666666666667 | 12.257 |
| 0.8048611111111111 | 12.257 |
| 0.8055555555555555 | 12.257 |
| 0.80625 | 12.257 |
| 0.8069444444444445 | 12.257 |
| 0.8076388888888889 | 7.887 |
| 0.8083333333333332 | 7.887 |
| 0.8090277777777778 | 7.887 |
| 0.8097222222222222 | 7.887 |
| 0.8104166666666667 | 3.525 |
| 0.811111111111111 | 3.525 |
| 0.8118055555555556 | 3.525 |
| 0.8125 | 3.525 |
| 0.8131944444444444 | 3.525 |
| 0.813888888888889 | 0 |
| 0.8145833333333333 | 0 |
| 0.8152777777777778 | 0 |
| 0.8159722222222222 | 0 |
| 0.8166666666666668 | 0 |
| 0.8173611111111111 | 0 |
| 0.8180555555555555 | 0 |
| 0.81875 | 0 |
| 0.8194444444444445 | 0 |
| 0.8201388888888889 | 0 |
| 0.8208333333333333 | 0 |
| 0.8215277777777777 | 0 |
| 0.8222222222222223 | 0 |
| 0.8229166666666666 | 0 |
| 0.8236111111111111 | 0 |
| 0.8243055555555556 | 0 |
| 0.8250000000000001 | 0 |
| 0.8256944444444444 | 0 |
| 0.8263888888888888 | 0 |
| 0.8270833333333334 | 0 |
| 0.8277777777777778 | 0 |
| 0.8284722222222222 | 0 |
| 0.8291666666666666 | 0 |
| 0.8298611111111112 | 0 |
| 0.8305555555555556 | 0 |
| 0.8312499999999999 | 0 |
| 0.8319444444444444 | 0 |
| 0.8326388888888889 | 0 |
| 0.8333333333333334 | 0 |
| 0.8340277777777777 | 0 |
| 0.8347222222222223 | 0 |
| 0.8354166666666667 | 0 |
| 0.8361111111111111 | 0 |
| 0.8368055555555555 | 0 |
| 0.8375 | 0 |
| 0.8381944444444445 | 0 |
| 0.8388888888888889 | 0 |
| 0.8395833333333332 | 0 |
| 0.8402777777777778 | 0 |
| 0.8409722222222222 | 0 |
| 0.8416666666666667 | 0 |
| 0.842361111111111 | 0 |
| 0.8430555555555556 | 0 |
| 0.84375 | 0 |
| 0.8444444444444444 | 0 |
| 0.845138888888889 | 0 |
| 0.8458333333333333 | 0 |
| 0.8465277777777778 | 0 |
| 0.8472222222222222 | 0 |
| 0.8479166666666668 | 0 |
| 0.8486111111111111 | 0 |
| 0.8493055555555555 | 0 |
| 0.85 | 0 |
| 0.8506944444444445 | 0 |
| 0.8513888888888889 | 0 |
| 0.8520833333333333 | 0 |
| 0.8527777777777777 | 0 |
| 0.8534722222222223 | 0 |
| 0.8541666666666666 | 0 |
| 0.8548611111111111 | 0 |
| 0.8555555555555556 | 0 |
| 0.8562500000000001 | 0 |
| 0.8569444444444444 | 0 |
| 0.8576388888888888 | 0 |
| 0.8583333333333334 | 0 |
| 0.8590277777777778 | 0 |
| 0.8597222222222222 | 0 |
| 0.8604166666666666 | 0 |
| 0.8611111111111112 | 0 |
| 0.8618055555555556 | 0 |
| 0.8624999999999999 | 0 |
| 0.8631944444444444 | 0 |
| 0.8638888888888889 | 0 |
| 0.8645833333333334 | 0 |
| 0.8652777777777777 | 0 |
| 0.8659722222222223 | 0 |
| 0.8666666666666667 | 0 |
| 0.8673611111111111 | 0 |
| 0.8680555555555555 | 0 |
| 0.86875 | 0 |
| 0.8694444444444445 | 0 |
| 0.8701388888888889 | 0 |
| 0.8708333333333332 | 0 |
| 0.8715277777777778 | 0 |
| 0.8722222222222222 | 0 |
| 0.8729166666666667 | 0 |
| 0.873611111111111 | 0 |
| 0.8743055555555556 | 0 |
| 0.875 | 0 |
| 0.8756944444444444 | 0 |
| 0.876388888888889 | 0 |
| 0.8770833333333333 | 0 |
| 0.8777777777777778 | 0 |
| 0.8784722222222222 | 0 |
| 0.8791666666666668 | 0 |
| 0.8798611111111111 | 0 |
| 0.8805555555555555 | 0 |
| 0.88125 | 0 |
| 0.8819444444444445 | 0 |
| 0.8826388888888889 | 0 |
| 0.8833333333333333 | 0 |
| 0.8840277777777777 | 0 |
| 0.8847222222222223 | 0 |
| 0.8854166666666666 | 0 |
| 0.8861111111111111 | 0 |
| 0.8868055555555556 | 0 |
| 0.8875000000000001 | 0 |
| 0.8881944444444444 | 0 |
| 0.8888888888888888 | 0 |
| 0.8895833333333334 | 0 |
| 0.8902777777777778 | 0 |
| 0.8909722222222222 | 0 |
| 0.8916666666666666 | 0 |
| 0.8923611111111112 | 0 |
| 0.8930555555555556 | 0 |
| 0.8937499999999999 | 0 |
| 0.8944444444444444 | 0 |
| 0.8951388888888889 | 0 |
| 0.8958333333333334 | 0 |
| 0.8965277777777777 | 0 |
| 0.8972222222222223 | 0 |
| 0.8979166666666667 | 0 |
| 0.8986111111111111 | 0 |
| 0.8993055555555555 | 0 |
| 0.9 | 0 |
| 0.9006944444444445 | 0 |
| 0.9013888888888889 | 0 |
| 0.9020833333333332 | 0 |
| 0.9027777777777778 | 0 |
| 0.9034722222222222 | 0 |
| 0.9041666666666667 | 0 |
| 0.904861111111111 | 0 |
| 0.9055555555555556 | 0 |
| 0.90625 | 0 |
| 0.9069444444444444 | 0 |
| 0.907638888888889 | 0 |
| 0.9083333333333333 | 0 |
| 0.9090277777777778 | 0 |
| 0.9097222222222222 | 0 |
| 0.9104166666666668 | 0 |
| 0.9111111111111111 | 0 |
| 0.9118055555555555 | 0 |
| 0.9125 | 0 |
| 0.9131944444444445 | 0 |
| 0.9138888888888889 | 0 |
| 0.9145833333333333 | 0 |
| 0.9152777777777777 | 0 |
| 0.9159722222222223 | 0 |
| 0.9166666666666666 | 0 |
| 0.9173611111111111 | 0 |
| 0.9180555555555556 | 0 |
| 0.9187500000000001 | 0 |
| 0.9194444444444444 | 0 |
| 0.9201388888888888 | 0 |
| 0.9208333333333334 | 0 |
| 0.9215277777777778 | 0 |
| 0.9222222222222222 | 0 |
| 0.9229166666666666 | 0 |
| 0.9236111111111112 | 0 |
| 0.9243055555555556 | 0 |
| 0.9249999999999999 | 0 |
| 0.9256944444444444 | 0 |
| 0.9263888888888889 | 0 |
| 0.9270833333333334 | 0 |
| 0.9277777777777777 | 0 |
| 0.9284722222222223 | 0 |
| 0.9291666666666667 | 0 |
| 0.9298611111111111 | 0 |
| 0.9305555555555555 | 0 |
| 0.93125 | 0 |
| 0.9319444444444445 | 0 |
| 0.9326388888888889 | 0 |
| 0.9333333333333332 | 0 |
| 0.9340277777777778 | 0 |
| 0.9347222222222222 | 0 |
| 0.9354166666666667 | 0 |
| 0.936111111111111 | 0 |
| 0.9368055555555556 | 0 |
| 0.9375 | 0 |
| 0.9381944444444444 | 0 |
| 0.938888888888889 | 0 |
| 0.9395833333333333 | 0 |
| 0.9402777777777778 | 0 |
| 0.9409722222222222 | 0 |
| 0.9416666666666668 | 0 |
| 0.9423611111111111 | 0 |
| 0.9430555555555555 | 0 |
| 0.94375 | 0 |
| 0.9444444444444445 | 0 |
| 0.9451388888888889 | 0 |
| 0.9458333333333333 | 0 |
| 0.9465277777777777 | 0 |
| 0.9472222222222223 | 0 |
| 0.9479166666666666 | 0 |
| 0.9486111111111111 | 0 |
| 0.9493055555555556 | 0 |
| 0.9500000000000001 | 0 |
| 0.9506944444444444 | 0 |
| 0.9513888888888888 | 0 |
| 0.9520833333333334 | 0 |
| 0.9527777777777778 | 0 |
| 0.9534722222222222 | 0 |
| 0.9541666666666666 | 0 |
| 0.9548611111111112 | 0 |
| 0.9555555555555556 | 0 |
| 0.9562499999999999 | 0 |
| 0.9569444444444444 | 0 |
| 0.9576388888888889 | 0 |
| 0.9583333333333334 | 0 |
| 0.9590277777777777 | 0 |
| 0.9597222222222223 | 0 |
| 0.9604166666666667 | 0 |
| 0.9611111111111111 | 0 |
| 0.9618055555555555 | 0 |
| 0.9625 | 0 |
| 0.9631944444444445 | 0 |
| 0.9638888888888889 | 0 |
| 0.9645833333333332 | 0 |
| 0.9652777777777778 | 0 |
| 0.9659722222222222 | 0 |
| 0.9666666666666667 | 0 |
| 0.967361111111111 | 0 |
| 0.9680555555555556 | 0 |
| 0.96875 | 0 |
| 0.9694444444444444 | 0 |
| 0.970138888888889 | 0 |
| 0.9708333333333333 | 0 |
| 0.9715277777777778 | 0 |
| 0.9722222222222222 | 0 |
| 0.9729166666666668 | 0 |
| 0.9736111111111111 | 0 |
| 0.9743055555555555 | 0 |
| 0.975 | 0 |
| 0.9756944444444445 | 0 |
| 0.9763888888888889 | 0 |
| 0.9770833333333333 | 0 |
| 0.9777777777777777 | 0 |
| 0.9784722222222223 | 0 |
| 0.9791666666666666 | 0 |
| 0.9798611111111111 | 0 |
| 0.9805555555555556 | 0 |
| 0.9812500000000001 | 0 |
| 0.9819444444444444 | 0 |
| 0.9826388888888888 | 0 |
| 0.9833333333333334 | 0 |
| 0.9840277777777778 | 0 |
| 0.9847222222222222 | 0 |
| 0.9854166666666666 | 0 |
| 0.9861111111111112 | 0 |
| 0.9868055555555556 | 0 |
| 0.9874999999999999 | 0 |
| 0.9881944444444444 | 0 |
| 0.9888888888888889 | 0 |
| 0.9895833333333334 | 0 |
| 0.9902777777777777 | 0 |
| 0.9909722222222223 | 0 |
| 0.9916666666666667 | 0 |
| 0.9923611111111111 | 0 |
| 0.9930555555555555 | 0 |
| 0.99375 | 0 |
| 0.9944444444444445 | 0 |
| 0.9951388888888889 | 0 |
| 0.9958333333333332 | 0 |
| 0.9965277777777778 | 0 |
| 0.9972222222222222 | 0 |
| 0.9979166666666667 | 0 |
| 0.998611111111111 | 0 |
| 0.9993055555555556 | 0 |